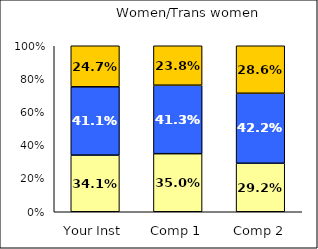
| Category | Low Pluralistic Orientation | Average Pluralistic Orientation | High Pluralistic Orientation |
|---|---|---|---|
| Your Inst | 0.341 | 0.411 | 0.247 |
| Comp 1 | 0.35 | 0.413 | 0.238 |
| Comp 2 | 0.292 | 0.422 | 0.286 |